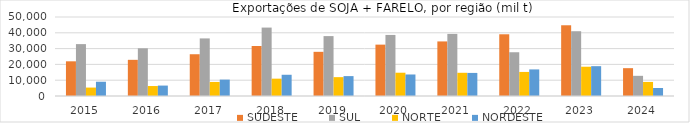
| Category | SUDESTE | SUL | NORTE | NORDESTE |
|---|---|---|---|---|
| 2015.0 | 21951.984 | 32838.329 | 5333.736 | 9026.777 |
| 2016.0 | 22892.038 | 30181.422 | 6308.76 | 6597.222 |
| 2017.0 | 26431.447 | 36449.155 | 8888.392 | 10378.808 |
| 2018.0 | 31628.825 | 43306.785 | 10974.769 | 13438.158 |
| 2019.0 | 27958.292 | 37911.569 | 11932.96 | 12588.841 |
| 2020.0 | 32512.287 | 38649.137 | 14737.499 | 13618.417 |
| 2021.0 | 34541.06 | 39304.912 | 14689.56 | 14606.019 |
| 2022.0 | 39064.867 | 27695.307 | 15229.078 | 16822.03 |
| 2023.0 | 44766.493 | 40998.891 | 18526.172 | 18879.884 |
| 2024.0 | 17616.544 | 12771.079 | 8900.826 | 5081.081 |